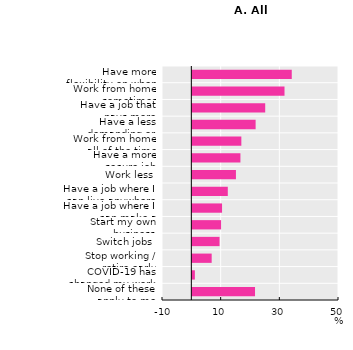
| Category | Series 0 |
|---|---|
| None of these apply to me | 21.371 |
| COVID-19 has changed my work priorities | 0.865 |
| Stop working / retire early | 6.594 |
| Switch jobs | 9.28 |
| Start my own business | 9.801 |
| Have a job where I can make a difference | 10.132 |
| Have a job where I can live anywhere | 12.089 |
| Work less | 14.864 |
| Have a more secure job | 16.394 |
| Work from home all of the time | 16.708 |
| Have a less demanding or stressful job | 21.576 |
| Have a job that pays more | 24.842 |
| Work from home sometimes | 31.426 |
| Have more flexibility on when I work | 33.895 |